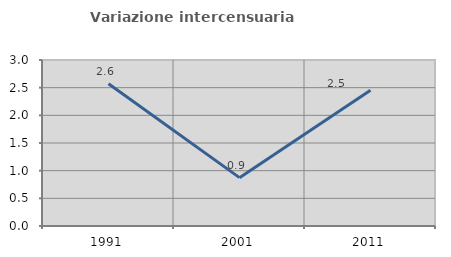
| Category | Variazione intercensuaria annua |
|---|---|
| 1991.0 | 2.571 |
| 2001.0 | 0.874 |
| 2011.0 | 2.453 |